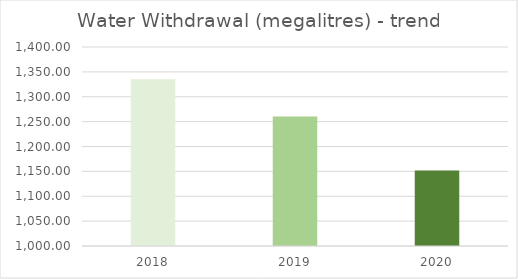
| Category | Series 0 |
|---|---|
| 0 | 1335.27 |
| 1 | 1260.32 |
| 2 | 1151.81 |